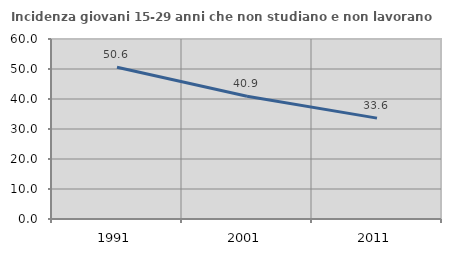
| Category | Incidenza giovani 15-29 anni che non studiano e non lavorano  |
|---|---|
| 1991.0 | 50.575 |
| 2001.0 | 40.909 |
| 2011.0 | 33.628 |